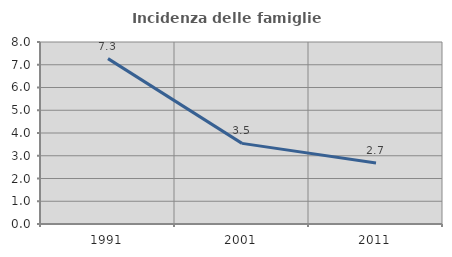
| Category | Incidenza delle famiglie numerose |
|---|---|
| 1991.0 | 7.269 |
| 2001.0 | 3.544 |
| 2011.0 | 2.681 |